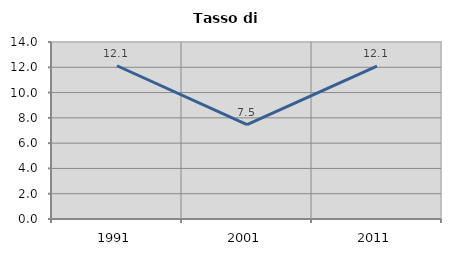
| Category | Tasso di disoccupazione   |
|---|---|
| 1991.0 | 12.121 |
| 2001.0 | 7.469 |
| 2011.0 | 12.097 |